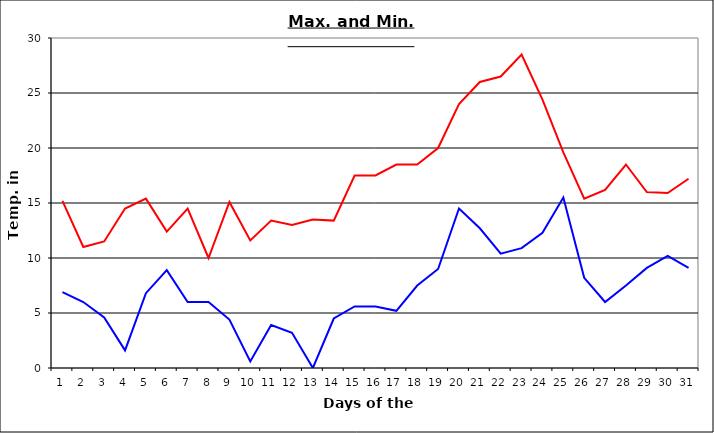
| Category | Series 0 | Series 1 |
|---|---|---|
| 0 | 15.2 | 6.9 |
| 1 | 11 | 6 |
| 2 | 11.5 | 4.6 |
| 3 | 14.5 | 1.6 |
| 4 | 15.4 | 6.8 |
| 5 | 12.4 | 8.9 |
| 6 | 14.5 | 6 |
| 7 | 10 | 6 |
| 8 | 15.1 | 4.4 |
| 9 | 11.6 | 0.6 |
| 10 | 13.4 | 3.9 |
| 11 | 13 | 3.2 |
| 12 | 13.5 | 0 |
| 13 | 13.4 | 4.5 |
| 14 | 17.5 | 5.6 |
| 15 | 17.5 | 5.6 |
| 16 | 18.5 | 5.2 |
| 17 | 18.5 | 7.5 |
| 18 | 20 | 9 |
| 19 | 24 | 14.5 |
| 20 | 26 | 12.7 |
| 21 | 26.5 | 10.4 |
| 22 | 28.5 | 10.9 |
| 23 | 24.4 | 12.3 |
| 24 | 19.6 | 15.5 |
| 25 | 15.4 | 8.2 |
| 26 | 16.2 | 6 |
| 27 | 18.5 | 7.5 |
| 28 | 16 | 9.1 |
| 29 | 15.9 | 10.2 |
| 30 | 17.2 | 9.1 |